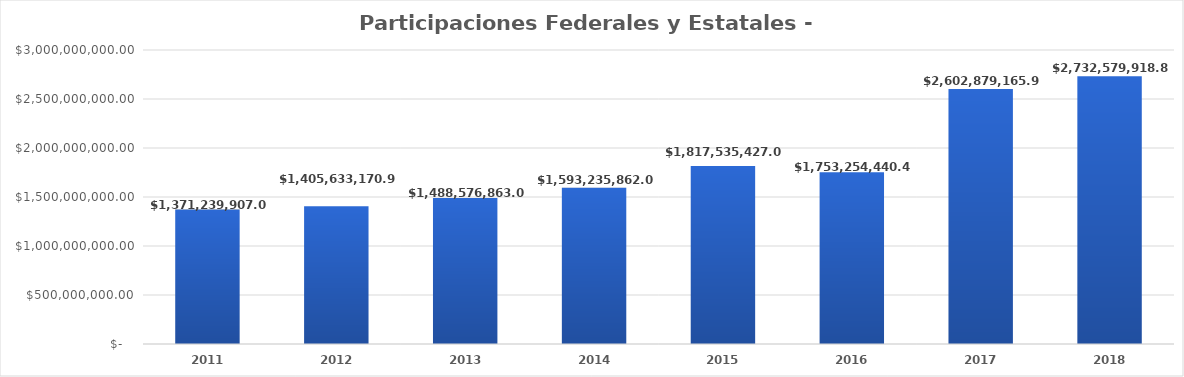
| Category | Participaciones Federales y Estatales - Ramo 28 |
|---|---|
| 2011.0 | 1371239907 |
| 2012.0 | 1405633170.9 |
| 2013.0 | 1488576863 |
| 2014.0 | 1593235862 |
| 2015.0 | 1817535427 |
| 2016.0 | 1753254440.43 |
| 2017.0 | 2602879165.99 |
| 2018.0 | 2732579918.84 |